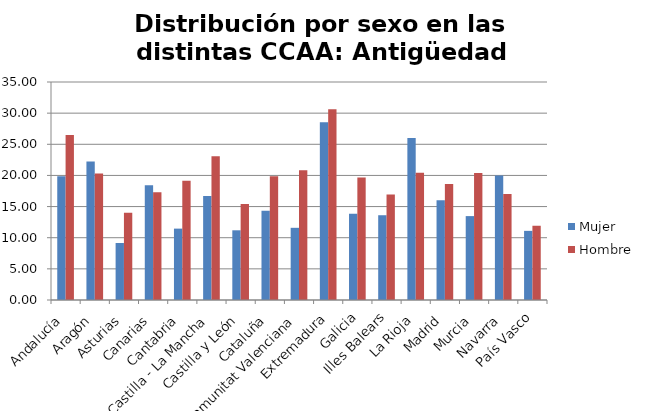
| Category | Mujer | Hombre |
|---|---|---|
| Andalucía | 19.87 | 26.48 |
| Aragón | 22.24 | 20.32 |
| Asturias | 9.15 | 14.02 |
| Canarias | 18.44 | 17.3 |
| Cantabria | 11.46 | 19.13 |
| Castilla - La Mancha | 16.69 | 23.06 |
| Castilla y León | 11.19 | 15.41 |
| Cataluña | 14.32 | 19.88 |
| Comunitat Valenciana | 11.59 | 20.83 |
| Extremadura | 28.53 | 30.61 |
| Galicia | 13.84 | 19.65 |
| Illes Balears | 13.61 | 16.95 |
| La Rioja | 26 | 20.43 |
| Madrid | 16 | 18.63 |
| Murcia | 13.47 | 20.38 |
| Navarra | 20 | 17 |
| País Vasco | 11.1 | 11.92 |